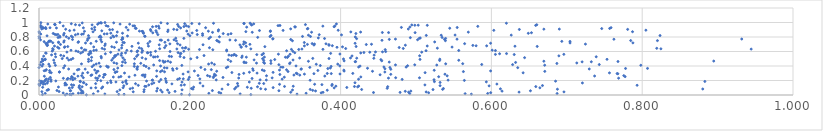
| Category | Series 0 |
|---|---|
| 0.03471809940780936 | 0.001 |
| 0.0628978927289243 | 0.002 |
| 0.1995794811079796 | 0.003 |
| 0.04272266488515289 | 0.004 |
| 0.2809404261100919 | 0.005 |
| 0.00458940075045273 | 0.006 |
| 0.04073927362761612 | 0.007 |
| 0.10568326306840174 | 0.008 |
| 0.11283316601962923 | 0.009 |
| 0.18900033131436 | 0.01 |
| 0.5734432919493996 | 0.011 |
| 0.34219767440783155 | 0.012 |
| 0.03703062416410229 | 0.013 |
| 0.08734879108575241 | 0.014 |
| 0.26676368256001 | 0.015 |
| 0.07212546008012231 | 0.016 |
| 0.045039601844262374 | 0.017 |
| 0.5651639700341141 | 0.018 |
| 0.4916722516117987 | 0.019 |
| 0.6871632711086179 | 0.02 |
| 0.5950885448225613 | 0.021 |
| 0.008232136410875118 | 0.022 |
| 0.22529547685810605 | 0.023 |
| 0.354276858125332 | 0.024 |
| 0.05226722493451394 | 0.025 |
| 0.24112710883399305 | 0.026 |
| 0.05593852667634817 | 0.027 |
| 0.03205019689438694 | 0.028 |
| 0.05841665688824747 | 0.029 |
| 0.3742544230528102 | 0.03 |
| 0.5167700513902381 | 0.031 |
| 0.5990619411059558 | 0.032 |
| 0.17256728204250313 | 0.033 |
| 0.4436390142723057 | 0.034 |
| 0.23860491473609152 | 0.035 |
| 0.47890002115238584 | 0.036 |
| 0.3766793765617339 | 0.037 |
| 0.33390334288328993 | 0.038 |
| 0.490169405845859 | 0.039 |
| 0.6366989414177403 | 0.04 |
| 0.16339558320439831 | 0.041 |
| 0.5134841379907712 | 0.042 |
| 0.6962454062782091 | 0.043 |
| 0.12495075305761767 | 0.044 |
| 0.13908367029248447 | 0.045 |
| 0.0038261332480417306 | 0.046 |
| 0.10363494464167652 | 0.047 |
| 0.02666417599809024 | 0.048 |
| 0.05788061085059919 | 0.049 |
| 0.18041761129008815 | 0.05 |
| 0.4857575244416236 | 0.051 |
| 0.07821202388468833 | 0.052 |
| 0.6141264319013726 | 0.053 |
| 0.4931575899874741 | 0.054 |
| 0.1560687274236829 | 0.055 |
| 0.3667760526250396 | 0.056 |
| 0.041467478363544384 | 0.057 |
| 0.651762081948474 | 0.058 |
| 0.3181924649397415 | 0.059 |
| 0.041938916326764955 | 0.06 |
| 0.22996427571882547 | 0.061 |
| 0.023818548999440824 | 0.062 |
| 0.05607006581198335 | 0.063 |
| 0.3630039059877329 | 0.064 |
| 0.010706427298888106 | 0.065 |
| 0.3822912778572393 | 0.066 |
| 0.16137181000215312 | 0.067 |
| 0.1705506427811281 | 0.068 |
| 0.33617952920377425 | 0.069 |
| 0.1072434301678051 | 0.07 |
| 0.18970289573768265 | 0.071 |
| 0.011919637866241931 | 0.072 |
| 0.13945450547457305 | 0.073 |
| 0.012626511981810674 | 0.074 |
| 0.522544051609832 | 0.075 |
| 0.4279122220621081 | 0.076 |
| 0.3596948129236601 | 0.077 |
| 0.5353008816723677 | 0.078 |
| 0.30040965233749994 | 0.079 |
| 0.6875564332954436 | 0.08 |
| 0.2041911940116624 | 0.081 |
| 0.24275476256825362 | 0.082 |
| 0.880329101515241 | 0.083 |
| 0.2594820889880252 | 0.084 |
| 0.6119454273611243 | 0.085 |
| 0.12087409792790396 | 0.086 |
| 0.29410980355177063 | 0.087 |
| 0.05433644718127161 | 0.088 |
| 0.5363418149445005 | 0.089 |
| 0.20221723085520488 | 0.09 |
| 0.15708281126850593 | 0.091 |
| 0.4617998573228683 | 0.092 |
| 0.28145601555439903 | 0.093 |
| 0.08302498559786625 | 0.094 |
| 0.12415126030437161 | 0.095 |
| 0.04024717275251662 | 0.096 |
| 0.06904251405017885 | 0.097 |
| 0.3914622530654389 | 0.098 |
| 0.6642868298106459 | 0.099 |
| 0.07524963989739945 | 0.1 |
| 0.111561000824211 | 0.101 |
| 0.3105564579563765 | 0.102 |
| 0.044081361840766935 | 0.103 |
| 0.4082596048288342 | 0.104 |
| 0.261264479569981 | 0.105 |
| 0.004875686387482808 | 0.106 |
| 0.27630944897067305 | 0.107 |
| 0.05298331487327896 | 0.108 |
| 0.20505330731190602 | 0.109 |
| 0.025765676545941356 | 0.11 |
| 0.08451030064530701 | 0.111 |
| 0.42262434564059803 | 0.112 |
| 0.28978327593787256 | 0.113 |
| 0.057212493912730304 | 0.114 |
| 0.4624781099222941 | 0.115 |
| 0.6589145081342206 | 0.116 |
| 0.41836644092661546 | 0.117 |
| 0.3256312928466535 | 0.118 |
| 0.14191624087516122 | 0.119 |
| 0.14039482641103404 | 0.12 |
| 0.33717231160639816 | 0.121 |
| 0.39376503415491987 | 0.122 |
| 0.4240374867847168 | 0.123 |
| 0.2174783746466326 | 0.124 |
| 0.2639670029187382 | 0.125 |
| 0.5969808709128088 | 0.126 |
| 0.11249358890958965 | 0.127 |
| 0.05361720363638991 | 0.128 |
| 0.5319229688659332 | 0.129 |
| 0.6677327093335624 | 0.13 |
| 0.3884080300951939 | 0.131 |
| 0.000611741904005162 | 0.132 |
| 0.13166332875138906 | 0.133 |
| 0.7932555019351889 | 0.134 |
| 0.18857127762805748 | 0.135 |
| 0.045950398561714796 | 0.136 |
| 0.034476640670317124 | 0.137 |
| 0.14553068648207249 | 0.138 |
| 0.5118206896432099 | 0.139 |
| 0.19285384405647285 | 0.14 |
| 0.043098717417665765 | 0.141 |
| 0.036516338688722776 | 0.142 |
| 0.37523556197761504 | 0.143 |
| 0.2507074446286727 | 0.144 |
| 0.06280450374776488 | 0.145 |
| 0.3888372965230126 | 0.146 |
| 0.3190216688241352 | 0.147 |
| 0.3655627960094509 | 0.148 |
| 0.005541210735868596 | 0.149 |
| 7.1900883607084026e-06 | 0.15 |
| 0.6072940502756272 | 0.151 |
| 0.008189738271355903 | 0.152 |
| 0.17627504904796445 | 0.153 |
| 0.14960223217209573 | 0.154 |
| 0.11642154200853289 | 0.155 |
| 0.12803755797038394 | 0.156 |
| 0.0751472752899637 | 0.157 |
| 0.2980282073153421 | 0.158 |
| 0.2632618578911238 | 0.159 |
| 0.03461534814823858 | 0.16 |
| 0.29218597003844077 | 0.161 |
| 0.00233549013342365 | 0.162 |
| 0.01090697851833 | 0.163 |
| 0.034792395443925574 | 0.164 |
| 0.21367801700573347 | 0.165 |
| 0.7206965269950599 | 0.166 |
| 0.15225775162921715 | 0.167 |
| 0.09077452260502218 | 0.168 |
| 0.4190810892948953 | 0.169 |
| 0.05944025711563548 | 0.17 |
| 0.05889594199813843 | 0.171 |
| 0.09558621128054091 | 0.172 |
| 0.5319841618874185 | 0.173 |
| 0.1689444443864776 | 0.174 |
| 0.11090124369358347 | 0.175 |
| 0.003726154375924736 | 0.176 |
| 0.006041756198938225 | 0.177 |
| 0.1896863319295612 | 0.178 |
| 0.27891789998567684 | 0.179 |
| 0.10202388309399066 | 0.18 |
| 0.5932769416555409 | 0.181 |
| 0.11496287427511492 | 0.182 |
| 0.05476371577313178 | 0.183 |
| 0.5244360330175999 | 0.184 |
| 0.15936434154720303 | 0.185 |
| 0.011753132534976278 | 0.186 |
| 0.8831109198005543 | 0.187 |
| 0.0036409457837047908 | 0.188 |
| 0.015941815224478222 | 0.189 |
| 0.05472714183517456 | 0.19 |
| 0.6851000619662838 | 0.191 |
| 0.14265169189983237 | 0.192 |
| 0.16848742929608185 | 0.193 |
| 0.022313120783578177 | 0.194 |
| 0.09503102116775146 | 0.195 |
| 0.0008154370503518378 | 0.196 |
| 0.08199804958304724 | 0.197 |
| 0.11548161298484308 | 0.198 |
| 0.007898271563472876 | 0.199 |
| 0.008359579164827434 | 0.2 |
| 0.5641380291285236 | 0.201 |
| 0.07733214513153186 | 0.202 |
| 0.3595851993224378 | 0.203 |
| 0.15011344296633353 | 0.204 |
| 0.5425579512195322 | 0.205 |
| 0.1506121203801931 | 0.206 |
| 0.3014965921999305 | 0.207 |
| 0.2350363670292999 | 0.208 |
| 0.29327335490797884 | 0.209 |
| 0.04489719061794627 | 0.21 |
| 0.5239257784372534 | 0.211 |
| 0.015912076300887014 | 0.212 |
| 0.16165354042680943 | 0.213 |
| 0.1980573061667286 | 0.214 |
| 0.4816543484996709 | 0.215 |
| 0.1838676372200513 | 0.216 |
| 0.037317213896918965 | 0.217 |
| 0.4238377919819418 | 0.218 |
| 0.3224806405029496 | 0.219 |
| 0.01273777077825116 | 0.22 |
| 0.009508161043824442 | 0.221 |
| 0.2133345762788506 | 0.222 |
| 0.1913444896286617 | 0.223 |
| 0.0418507541190621 | 0.224 |
| 0.16773964958216478 | 0.225 |
| 0.04770708008957383 | 0.226 |
| 0.18637681478597456 | 0.227 |
| 0.2825907315105212 | 0.228 |
| 0.03831711613170055 | 0.229 |
| 0.03230658192310319 | 0.23 |
| 0.07780079311564603 | 0.231 |
| 0.768697666336442 | 0.232 |
| 0.4634868395529909 | 0.233 |
| 0.26487481138109087 | 0.234 |
| 0.07522456268617307 | 0.235 |
| 0.30922669091245286 | 0.236 |
| 0.504630406648886 | 0.237 |
| 0.47304049548916305 | 0.238 |
| 0.058745583537544666 | 0.239 |
| 0.044533608705758954 | 0.24 |
| 0.23125476566855008 | 0.241 |
| 0.24402720612622966 | 0.242 |
| 0.01503106018451183 | 0.243 |
| 0.19937547243035578 | 0.244 |
| 0.08535569461892908 | 0.245 |
| 0.3253806636469633 | 0.246 |
| 0.1059053345086129 | 0.247 |
| 0.0985873178337911 | 0.248 |
| 0.4268306744202194 | 0.249 |
| 0.11953849103164473 | 0.25 |
| 0.14032961865323607 | 0.251 |
| 0.5300821696802024 | 0.252 |
| 0.7773616554910638 | 0.253 |
| 0.04333758169232757 | 0.254 |
| 0.10860341025454529 | 0.255 |
| 0.22654594426146735 | 0.256 |
| 0.15592455087406681 | 0.257 |
| 0.23188347338659113 | 0.258 |
| 0.0071025876063942825 | 0.259 |
| 0.05163259693669916 | 0.26 |
| 0.37906587425781424 | 0.261 |
| 0.7368827575234774 | 0.262 |
| 0.08012160387229876 | 0.263 |
| 0.5413560611071198 | 0.264 |
| 0.3017354786237287 | 0.265 |
| 0.05666205496604354 | 0.266 |
| 0.7756275635578731 | 0.267 |
| 0.2234755236371808 | 0.268 |
| 0.21096871521085406 | 0.269 |
| 0.06896004237443044 | 0.27 |
| 0.2343200952470237 | 0.271 |
| 0.13696491451626405 | 0.272 |
| 0.12724584557715926 | 0.273 |
| 0.34586388748884606 | 0.274 |
| 0.3380625900229567 | 0.275 |
| 0.13821074596325691 | 0.276 |
| 0.1407299099413959 | 0.277 |
| 0.0700968193227045 | 0.278 |
| 0.4523827639489086 | 0.279 |
| 0.08685635075107226 | 0.28 |
| 0.08621907009853773 | 0.281 |
| 0.08783113242107383 | 0.282 |
| 0.31945961461484484 | 0.283 |
| 0.26530670035326187 | 0.284 |
| 0.4665659524326485 | 0.285 |
| 0.2327242303682464 | 0.286 |
| 0.538397141451541 | 0.287 |
| 0.3520267672578203 | 0.288 |
| 0.1911247349313269 | 0.289 |
| 0.3991755653434058 | 0.29 |
| 0.046509300293537496 | 0.291 |
| 0.3425802076114185 | 0.292 |
| 0.7677117270068199 | 0.293 |
| 0.36463714288319254 | 0.294 |
| 0.38762742736991357 | 0.295 |
| 0.7667373433114493 | 0.296 |
| 0.38231678921811507 | 0.297 |
| 0.4161804997733114 | 0.298 |
| 0.2715092122053982 | 0.299 |
| 0.3411857322697847 | 0.3 |
| 0.05795323616492153 | 0.301 |
| 0.289208307587499 | 0.302 |
| 0.11343314280583984 | 0.303 |
| 0.07587039691534074 | 0.304 |
| 0.756594715243724 | 0.305 |
| 0.6420871868655366 | 0.306 |
| 0.016188686394519033 | 0.307 |
| 0.5120737143426126 | 0.308 |
| 0.06459244647926607 | 0.309 |
| 0.255828935955592 | 0.31 |
| 0.10104166647140293 | 0.311 |
| 0.310472435389232 | 0.312 |
| 0.014256225937879799 | 0.313 |
| 0.2790443471239143 | 0.314 |
| 0.10150834580934051 | 0.315 |
| 0.027005234956321962 | 0.316 |
| 0.45869825822122945 | 0.317 |
| 0.027153423472237287 | 0.318 |
| 0.1977577005038018 | 0.319 |
| 0.1665027765540108 | 0.32 |
| 0.10339110338277385 | 0.321 |
| 0.16112216161119994 | 0.322 |
| 0.5628658752960788 | 0.323 |
| 0.33028206944237126 | 0.324 |
| 0.07690709674331188 | 0.325 |
| 0.6708129259465172 | 0.326 |
| 0.44231070244746884 | 0.327 |
| 0.2356799485863774 | 0.328 |
| 0.07825512031577464 | 0.329 |
| 0.4046790514153703 | 0.33 |
| 0.20612389206599277 | 0.331 |
| 0.5989498174361702 | 0.332 |
| 0.15615873808254596 | 0.333 |
| 0.29875546412737497 | 0.334 |
| 0.006860243491602771 | 0.335 |
| 0.16330788949999026 | 0.336 |
| 0.014109379243826579 | 0.337 |
| 0.36984005195980085 | 0.338 |
| 0.008882640243364335 | 0.339 |
| 0.28410356935901515 | 0.34 |
| 0.5241594916209306 | 0.341 |
| 0.1777765598621435 | 0.342 |
| 0.4042969388213863 | 0.343 |
| 0.3189625219726934 | 0.344 |
| 0.2961557875201831 | 0.345 |
| 0.07391791651520663 | 0.346 |
| 0.05098186520610617 | 0.347 |
| 0.328337934364357 | 0.348 |
| 0.009694697880555289 | 0.349 |
| 0.22854907028847377 | 0.35 |
| 0.099369032922932 | 0.351 |
| 0.2200711301831053 | 0.352 |
| 0.05296565246827242 | 0.353 |
| 0.1302528564961815 | 0.354 |
| 0.46661955445252357 | 0.355 |
| 0.34746490645865963 | 0.356 |
| 0.06124966572923453 | 0.357 |
| 0.03931799227433341 | 0.358 |
| 0.72978246467221 | 0.359 |
| 0.34795648475854074 | 0.36 |
| 0.2834532080291715 | 0.361 |
| 0.4588122406769389 | 0.362 |
| 0.1770913316767238 | 0.363 |
| 0.18278989371899224 | 0.364 |
| 0.3830989143492803 | 0.365 |
| 0.777945353772589 | 0.366 |
| 0.807054166963916 | 0.367 |
| 0.14577766463695283 | 0.368 |
| 0.43571150529235514 | 0.369 |
| 0.1299108531176551 | 0.37 |
| 0.10443514434361724 | 0.371 |
| 0.3864045022727991 | 0.372 |
| 0.16975924331188663 | 0.373 |
| 0.032562113510257236 | 0.374 |
| 0.1663083906333003 | 0.375 |
| 0.24843180475557702 | 0.376 |
| 0.6349205021025296 | 0.377 |
| 6.167264687932303e-05 | 0.378 |
| 0.4654016990676762 | 0.379 |
| 0.21470477600423482 | 0.38 |
| 0.35917836696480415 | 0.381 |
| 0.09152391007393411 | 0.382 |
| 0.3234960199982712 | 0.383 |
| 0.3207701961380073 | 0.384 |
| 0.4869133915931692 | 0.385 |
| 0.4239251980301315 | 0.386 |
| 0.4574200064156994 | 0.387 |
| 0.2504744135159386 | 0.388 |
| 0.09170437874656949 | 0.389 |
| 0.13079800034099 | 0.39 |
| 0.07048941527424074 | 0.391 |
| 0.08146966197268594 | 0.392 |
| 0.14198991693427282 | 0.393 |
| 0.38744614842626884 | 0.394 |
| 0.12637193248225095 | 0.395 |
| 0.014193829670142677 | 0.396 |
| 0.08972514468905825 | 0.397 |
| 0.004040042823961715 | 0.398 |
| 0.4258250423793592 | 0.399 |
| 0.1612595778009747 | 0.4 |
| 0.34089092150998357 | 0.401 |
| 0.3988885747732037 | 0.402 |
| 0.03417091451249012 | 0.403 |
| 0.4888495801364316 | 0.404 |
| 0.1099357428500894 | 0.405 |
| 0.37310666752756977 | 0.406 |
| 0.13913848100222367 | 0.407 |
| 0.1894625465907569 | 0.408 |
| 0.0217390392272025 | 0.409 |
| 0.7981777337451421 | 0.41 |
| 0.6706833401522698 | 0.411 |
| 0.07262733759442067 | 0.412 |
| 0.5275694775356127 | 0.413 |
| 0.15207461574396114 | 0.414 |
| 0.47277718223401294 | 0.415 |
| 0.49833643485434165 | 0.416 |
| 0.0011666816889231012 | 0.417 |
| 0.31815730007826054 | 0.418 |
| 0.6281397429819029 | 0.419 |
| 0.7430752865912482 | 0.42 |
| 0.5871554157696608 | 0.421 |
| 0.23260151404070914 | 0.422 |
| 0.005294381259561111 | 0.423 |
| 0.3677460319416551 | 0.424 |
| 0.012984211366346558 | 0.425 |
| 0.3961922901324097 | 0.426 |
| 0.22493594463675318 | 0.427 |
| 0.07584843641300586 | 0.428 |
| 0.05635406599450573 | 0.429 |
| 0.5393687697197099 | 0.43 |
| 0.12648480083874278 | 0.431 |
| 0.561973037608011 | 0.432 |
| 0.33235694000852906 | 0.433 |
| 0.10310874458819207 | 0.434 |
| 0.686855354160206 | 0.435 |
| 0.3075965417992604 | 0.436 |
| 0.13498258563468554 | 0.437 |
| 0.2990414311149292 | 0.438 |
| 0.07966462324538168 | 0.439 |
| 0.288468575909801 | 0.44 |
| 0.22903704526177915 | 0.441 |
| 0.7132732444081827 | 0.442 |
| 0.02050775444143845 | 0.443 |
| 0.3330994290242307 | 0.444 |
| 0.09946337381147652 | 0.445 |
| 0.27459772266150256 | 0.446 |
| 0.11453832964899256 | 0.447 |
| 0.27204983413377315 | 0.448 |
| 0.6320929305054975 | 0.449 |
| 0.29791903715325146 | 0.45 |
| 0.16562555887617114 | 0.451 |
| 0.17443223988767348 | 0.452 |
| 0.0026124178842774418 | 0.453 |
| 0.46450040999585857 | 0.454 |
| 0.11084577532635558 | 0.455 |
| 0.2719564793709447 | 0.456 |
| 0.7203146997885855 | 0.457 |
| 0.732532672127752 | 0.458 |
| 0.41931087486604046 | 0.459 |
| 0.16743550501053267 | 0.46 |
| 0.4198690984155091 | 0.461 |
| 0.767869646281046 | 0.462 |
| 0.06565233770591711 | 0.463 |
| 0.25424993906278676 | 0.464 |
| 0.3572947085660774 | 0.465 |
| 0.6695760209835853 | 0.466 |
| 0.1710891531772601 | 0.467 |
| 0.894895119511627 | 0.468 |
| 0.16440305239896671 | 0.469 |
| 0.0047625892593230945 | 0.47 |
| 0.4046802582770862 | 0.471 |
| 0.454612940617494 | 0.472 |
| 0.3074919005146573 | 0.473 |
| 0.06938842910951706 | 0.474 |
| 0.15995600280905015 | 0.475 |
| 0.5313447878591331 | 0.476 |
| 0.29811462349167467 | 0.477 |
| 0.005705545625478681 | 0.478 |
| 0.5567368573338418 | 0.479 |
| 0.0964698571083648 | 0.48 |
| 0.019521061159352458 | 0.481 |
| 0.03949699727104132 | 0.482 |
| 0.33691912842478083 | 0.483 |
| 0.2852628861362753 | 0.484 |
| 0.11341189960609314 | 0.485 |
| 0.2509014722012917 | 0.486 |
| 0.008178487248044793 | 0.487 |
| 0.45343892251714957 | 0.488 |
| 0.3126450769913859 | 0.489 |
| 0.04251380232729226 | 0.49 |
| 0.5053322498918039 | 0.491 |
| 0.7533477388778862 | 0.492 |
| 0.065726696857339 | 0.493 |
| 0.5316145442354967 | 0.494 |
| 0.008219883005189263 | 0.495 |
| 0.0042649954295582325 | 0.496 |
| 0.40380950871033117 | 0.497 |
| 0.14159978319381042 | 0.498 |
| 0.20132973718405742 | 0.499 |
| 0.12684357945398028 | 0.5 |
| 0.2965476014660339 | 0.501 |
| 0.030786848008764803 | 0.502 |
| 0.38462750114002653 | 0.503 |
| 0.04493505124880565 | 0.504 |
| 0.36308663678860376 | 0.505 |
| 0.4440697328066427 | 0.506 |
| 0.09832961428201951 | 0.507 |
| 0.4213963636621334 | 0.508 |
| 0.03738563911848336 | 0.509 |
| 0.34567844068332726 | 0.51 |
| 0.41315155871641923 | 0.511 |
| 0.08270253008204984 | 0.512 |
| 0.11116562918436237 | 0.513 |
| 0.13682419361282686 | 0.514 |
| 0.6440111646647143 | 0.515 |
| 0.1923030991032947 | 0.516 |
| 0.20971949432272471 | 0.517 |
| 0.32937170162213 | 0.518 |
| 0.26891542025229814 | 0.519 |
| 0.06977331422150784 | 0.52 |
| 0.3268061995367734 | 0.521 |
| 0.2749816428710077 | 0.522 |
| 0.2989246488515327 | 0.523 |
| 0.15190167574164753 | 0.524 |
| 0.15401869557377051 | 0.525 |
| 0.022060721491418148 | 0.526 |
| 0.7390149225450234 | 0.527 |
| 0.10053406421598254 | 0.528 |
| 0.15730495993996818 | 0.529 |
| 0.17575980460010865 | 0.53 |
| 0.08236212355038601 | 0.531 |
| 0.187165299467176 | 0.532 |
| 0.12943335123779112 | 0.533 |
| 0.17275676147282854 | 0.534 |
| 0.33077039693445576 | 0.535 |
| 0.006189331255499449 | 0.536 |
| 0.26948581095117985 | 0.537 |
| 0.0328124398288676 | 0.538 |
| 0.41516875552213944 | 0.539 |
| 0.6894970605336683 | 0.54 |
| 0.5048207430187995 | 0.541 |
| 0.10043300838975812 | 0.542 |
| 0.26159008932282257 | 0.543 |
| 0.21885462587238508 | 0.544 |
| 0.2553288276012641 | 0.545 |
| 0.10218411348873949 | 0.546 |
| 0.10908585641243582 | 0.547 |
| 0.02892299088675357 | 0.548 |
| 0.14835434678771767 | 0.549 |
| 0.4444885675302377 | 0.55 |
| 0.2518818459133718 | 0.551 |
| 0.25801183225420715 | 0.552 |
| 0.01666030629201785 | 0.553 |
| 0.1311738371930056 | 0.554 |
| 0.2957287159057605 | 0.555 |
| 0.06612583403133174 | 0.556 |
| 0.28884404141308284 | 0.557 |
| 0.6302644852270409 | 0.558 |
| 0.259285074550187 | 0.559 |
| 0.605359555686929 | 0.56 |
| 0.6960802403777886 | 0.561 |
| 0.3329826709811063 | 0.562 |
| 0.31752996811927353 | 0.563 |
| 0.10478025072383612 | 0.564 |
| 0.39908509475459025 | 0.565 |
| 0.02156325351721706 | 0.566 |
| 0.06597404966452941 | 0.567 |
| 0.08799577731649172 | 0.568 |
| 0.6108850746433825 | 0.569 |
| 0.18732666886146657 | 0.57 |
| 0.6200667755823314 | 0.571 |
| 0.29766693772819935 | 0.572 |
| 0.18822656610560187 | 0.573 |
| 0.38681835885500826 | 0.574 |
| 0.10963195375491587 | 0.575 |
| 0.06871684604326092 | 0.576 |
| 0.009523889601585532 | 0.577 |
| 0.055226326246527443 | 0.578 |
| 0.00877918745340028 | 0.579 |
| 0.4266816152437972 | 0.58 |
| 0.11475688925766003 | 0.581 |
| 0.144372712207974 | 0.582 |
| 0.339250092120636 | 0.583 |
| 0.1437137686199215 | 0.584 |
| 0.18448489872712232 | 0.585 |
| 0.4309088048355218 | 0.586 |
| 0.14805508483205268 | 0.587 |
| 0.13648577604223103 | 0.588 |
| 0.09502365371694865 | 0.589 |
| 0.43871620874545625 | 0.59 |
| 0.5075806703134103 | 0.591 |
| 0.03703685269291741 | 0.592 |
| 0.057888097297326226 | 0.593 |
| 0.44627424396964566 | 0.594 |
| 0.4555844565086663 | 0.595 |
| 0.1300615495776269 | 0.596 |
| 0.06760917233312819 | 0.597 |
| 0.052009324370257654 | 0.598 |
| 0.45977733886077005 | 0.599 |
| 0.17383976692341027 | 0.6 |
| 0.06841229927486198 | 0.601 |
| 0.33673737262062 | 0.602 |
| 0.15455055544944177 | 0.603 |
| 0.19208099266015208 | 0.604 |
| 0.01752939663969658 | 0.605 |
| 0.12242037380073942 | 0.606 |
| 0.04903151387271773 | 0.607 |
| 0.24894621728965977 | 0.608 |
| 0.13072938820050037 | 0.609 |
| 0.3284227193282942 | 0.61 |
| 0.5133397275864905 | 0.611 |
| 0.13733126419869293 | 0.612 |
| 0.6053387375435465 | 0.613 |
| 0.5566800485425932 | 0.614 |
| 0.0726945346357475 | 0.615 |
| 0.1165363048532343 | 0.616 |
| 0.04244138514666918 | 0.617 |
| 0.6010567476353659 | 0.618 |
| 0.07602343729643536 | 0.619 |
| 0.2488866203053398 | 0.62 |
| 0.06212265187336809 | 0.621 |
| 0.10609327838129609 | 0.622 |
| 0.06004084956402269 | 0.623 |
| 0.23053555377510973 | 0.624 |
| 0.018807366125997437 | 0.625 |
| 0.45917306559239834 | 0.626 |
| 0.21281755454301512 | 0.627 |
| 0.34451771724911207 | 0.628 |
| 0.3348129910751223 | 0.629 |
| 0.3765756136159649 | 0.63 |
| 0.19845381636079554 | 0.631 |
| 0.08690790329881559 | 0.632 |
| 0.9445386878970132 | 0.633 |
| 0.3487343344397009 | 0.634 |
| 0.18284296043548223 | 0.635 |
| 0.28096318352072996 | 0.636 |
| 0.8248052536265529 | 0.637 |
| 0.16006144440197628 | 0.638 |
| 0.13606760364120327 | 0.639 |
| 0.018159034453909297 | 0.64 |
| 0.40676443097523424 | 0.641 |
| 0.483100790074013 | 0.642 |
| 0.0837634944195228 | 0.643 |
| 0.8193213859798155 | 0.644 |
| 0.026472081383635257 | 0.645 |
| 0.5283237453878453 | 0.646 |
| 0.19377065971710838 | 0.647 |
| 0.05633780668100036 | 0.648 |
| 0.10959907841439157 | 0.649 |
| 0.19032683509154663 | 0.65 |
| 0.13296919706723787 | 0.651 |
| 0.2260647606104 | 0.652 |
| 0.16656507310666396 | 0.653 |
| 0.19466045876915108 | 0.654 |
| 0.4776998945110226 | 0.655 |
| 0.09999721667327244 | 0.656 |
| 0.03380336484315928 | 0.657 |
| 0.39522642181636725 | 0.658 |
| 0.02468752579687874 | 0.659 |
| 0.2680521969904701 | 0.66 |
| 0.5478323356039206 | 0.661 |
| 0.2681926372660439 | 0.662 |
| 0.07253878727926509 | 0.663 |
| 0.4025034625721182 | 0.664 |
| 0.03433373538018606 | 0.665 |
| 0.0965720595687301 | 0.666 |
| 0.2995599793439444 | 0.667 |
| 0.038181114647205985 | 0.668 |
| 0.4205774008004152 | 0.669 |
| 0.6607418391946567 | 0.67 |
| 0.12330772757874686 | 0.671 |
| 0.2747732306191111 | 0.672 |
| 0.6312574332444723 | 0.673 |
| 0.14513789665637739 | 0.674 |
| 0.020558050861124624 | 0.675 |
| 0.5148784609281423 | 0.676 |
| 0.3519995884371279 | 0.677 |
| 0.5937267455817316 | 0.678 |
| 0.5797305384327315 | 0.679 |
| 0.38905102066798647 | 0.68 |
| 0.16830454863137145 | 0.681 |
| 0.010942095898177571 | 0.682 |
| 0.08728504588547246 | 0.683 |
| 0.5753972236288527 | 0.684 |
| 0.38462711226770663 | 0.685 |
| 0.11003936139774315 | 0.686 |
| 0.4858842694384781 | 0.687 |
| 0.011226080879135084 | 0.688 |
| 0.36464433825909026 | 0.689 |
| 0.18711975803363978 | 0.69 |
| 0.26645127727052925 | 0.691 |
| 0.15946144232925338 | 0.692 |
| 0.21756859212455193 | 0.693 |
| 0.010263128607558552 | 0.694 |
| 0.38449345536644675 | 0.695 |
| 0.43407793551210727 | 0.696 |
| 0.028476774245335568 | 0.697 |
| 0.3559970015433384 | 0.698 |
| 0.2797453834172692 | 0.699 |
| 0.440970511225116 | 0.7 |
| 0.2713039340295634 | 0.701 |
| 0.724722542922178 | 0.702 |
| 0.36530471909490864 | 0.703 |
| 0.08790551053700295 | 0.704 |
| 0.17360535621930914 | 0.705 |
| 0.38061441389301176 | 0.706 |
| 0.1837982089058247 | 0.707 |
| 0.5644942534499625 | 0.708 |
| 0.3622800197650563 | 0.709 |
| 0.14446129862037643 | 0.71 |
| 0.009089604173642204 | 0.711 |
| 0.06876600120620838 | 0.712 |
| 0.41923118508480134 | 0.713 |
| 0.5989414910620602 | 0.714 |
| 0.1316938653907171 | 0.715 |
| 0.010990765026392242 | 0.716 |
| 0.061718351077816404 | 0.717 |
| 0.7043238942045561 | 0.718 |
| 0.7876777256691083 | 0.719 |
| 0.27401124072757493 | 0.72 |
| 0.018289896095385155 | 0.721 |
| 0.11311941605693143 | 0.722 |
| 0.025887504184609004 | 0.723 |
| 0.35187727005404285 | 0.724 |
| 0.11129818054970218 | 0.725 |
| 0.0518481792161186 | 0.726 |
| 0.16704090213586303 | 0.727 |
| 0.10275068432802456 | 0.728 |
| 0.02589838837799512 | 0.729 |
| 0.03286386000824537 | 0.73 |
| 0.23904203461252127 | 0.731 |
| 0.5247723767531658 | 0.732 |
| 0.2717481979765075 | 0.733 |
| 0.08311528223036455 | 0.734 |
| 0.05238274556382606 | 0.735 |
| 0.006797210627545045 | 0.736 |
| 0.012974203500908514 | 0.737 |
| 0.147061659062777 | 0.738 |
| 0.7042396521413385 | 0.739 |
| 0.6933984997682874 | 0.74 |
| 0.07593928326361103 | 0.741 |
| 0.015617801442791866 | 0.742 |
| 0.0132929991414208 | 0.743 |
| 0.23718193179496244 | 0.744 |
| 0.014461839550504006 | 0.745 |
| 0.18220423264400562 | 0.746 |
| 0.033385334709509634 | 0.747 |
| 0.3360867823151505 | 0.748 |
| 0.5390008287902006 | 0.749 |
| 0.8202271157947166 | 0.75 |
| 0.7847408557561526 | 0.751 |
| 0.23577276980153078 | 0.752 |
| 0.0641549245584603 | 0.753 |
| 0.45490264767169314 | 0.754 |
| 0.2607279124113309 | 0.755 |
| 0.1623701922616656 | 0.756 |
| 0.1713230137803098 | 0.757 |
| 0.1606999202643882 | 0.758 |
| 0.2532001276652573 | 0.759 |
| 0.0019483463118437877 | 0.76 |
| 0.1791204546829142 | 0.761 |
| 0.5021055035564679 | 0.762 |
| 0.08189538207487373 | 0.763 |
| 0.10968024945652532 | 0.764 |
| 0.04446253601071941 | 0.765 |
| 0.33388850441645573 | 0.766 |
| 0.46460060695936556 | 0.767 |
| 0.5377689436354547 | 0.768 |
| 0.7624754423769129 | 0.769 |
| 0.5544220903924674 | 0.77 |
| 0.4727447007638262 | 0.771 |
| 0.9320244292787004 | 0.772 |
| 0.31005265498989465 | 0.773 |
| 0.11108073122242482 | 0.774 |
| 0.06470016325731688 | 0.775 |
| 0.31034252820542774 | 0.776 |
| 0.421240308025953 | 0.777 |
| 0.22532314638928913 | 0.778 |
| 0.37871934753959385 | 0.779 |
| 0.5392839212368836 | 0.78 |
| 0.19212489964081753 | 0.781 |
| 0.5044029799745942 | 0.782 |
| 0.03948138648994916 | 0.783 |
| 0.18133612482529624 | 0.784 |
| 0.00021045642954777363 | 0.785 |
| 0.5056537012332012 | 0.786 |
| 0.3704755113415109 | 0.787 |
| 0.06651328039325614 | 0.788 |
| 0.0953556275557179 | 0.789 |
| 0.0007354593556386154 | 0.79 |
| 0.4924994974968036 | 0.791 |
| 0.11075848647157838 | 0.792 |
| 0.025292981929191757 | 0.793 |
| 0.534624455527273 | 0.794 |
| 0.2900706867612409 | 0.795 |
| 0.08231849769200213 | 0.796 |
| 0.027769812034265946 | 0.797 |
| 0.22743152102649866 | 0.798 |
| 0.044406404103625514 | 0.799 |
| 0.079797091219841 | 0.8 |
| 0.4194599698720297 | 0.801 |
| 0.09924925004301612 | 0.802 |
| 0.23935541985109185 | 0.803 |
| 0.03628099044705775 | 0.804 |
| 0.00020986174901923112 | 0.805 |
| 0.306406374672776 | 0.806 |
| 0.3600338309641422 | 0.807 |
| 0.34948161011590717 | 0.808 |
| 0.14067511035934752 | 0.809 |
| 0.02751004089944957 | 0.81 |
| 0.04286549223900811 | 0.811 |
| 0.1401013608746107 | 0.812 |
| 0.08125853527574349 | 0.813 |
| 0.11735866811713734 | 0.814 |
| 0.09791698753446933 | 0.815 |
| 0.010663578819295578 | 0.816 |
| 0.10274813941468205 | 0.817 |
| 0.20009458629060772 | 0.818 |
| 0.06559618974938665 | 0.819 |
| 0.8236678922254151 | 0.82 |
| 0.30771181905794226 | 0.821 |
| 0.5136565974725024 | 0.822 |
| 0.21696184378839958 | 0.823 |
| 0.5334454063533679 | 0.824 |
| 0.3573646427252445 | 0.825 |
| 0.6263134554537287 | 0.826 |
| 0.5518290174171225 | 0.827 |
| 0.03264933603587413 | 0.828 |
| 0.40119361622143274 | 0.829 |
| 0.048249091049021656 | 0.83 |
| 0.022869568918446097 | 0.831 |
| 0.3716509345945355 | 0.832 |
| 0.157643222588461 | 0.833 |
| 0.20991585276436378 | 0.834 |
| 0.025095127433730324 | 0.835 |
| 0.25080148515192 | 0.836 |
| 0.05654362625343747 | 0.837 |
| 0.02091611866473242 | 0.838 |
| 0.19774928122612373 | 0.839 |
| 0.0023121000912087785 | 0.84 |
| 0.051612818612306315 | 0.841 |
| 0.08652592391776051 | 0.842 |
| 0.058842786241897774 | 0.843 |
| 0.09024324575559226 | 0.844 |
| 0.21690901265993953 | 0.845 |
| 0.2546462419272897 | 0.846 |
| 0.24432074890907043 | 0.847 |
| 0.4202923453049453 | 0.848 |
| 0.01881300725538497 | 0.849 |
| 0.0333546662564068 | 0.85 |
| 0.6489548205266239 | 0.851 |
| 0.11075409977827749 | 0.852 |
| 0.09524949693434852 | 0.853 |
| 0.13846281019172937 | 0.854 |
| 0.1384040003004958 | 0.855 |
| 0.20314425309111714 | 0.856 |
| 0.0003123315298378815 | 0.857 |
| 0.15090193207514666 | 0.858 |
| 0.6531190018665002 | 0.859 |
| 0.49880479808003403 | 0.86 |
| 0.46362676744256165 | 0.861 |
| 0.45538672538928965 | 0.862 |
| 0.15613720588392735 | 0.863 |
| 0.23013150895870654 | 0.864 |
| 0.28282122533530624 | 0.865 |
| 0.36149611945861504 | 0.866 |
| 0.5693877039480346 | 0.867 |
| 0.4265493191309624 | 0.868 |
| 0.10377855050889906 | 0.869 |
| 0.413573949867351 | 0.87 |
| 0.07162643240428822 | 0.871 |
| 0.00023693728467423554 | 0.872 |
| 0.7871860757737146 | 0.873 |
| 0.2743490447664397 | 0.874 |
| 0.1707268162686626 | 0.875 |
| 0.30686268675083855 | 0.876 |
| 0.13760156066320536 | 0.877 |
| 0.06032187736196577 | 0.878 |
| 0.13666406598167993 | 0.879 |
| 0.2246436072171056 | 0.88 |
| 0.13321444269430002 | 0.881 |
| 0.1959422679002759 | 0.882 |
| 0.23774264492928132 | 0.883 |
| 0.30687811475116805 | 0.884 |
| 0.08327850644425507 | 0.885 |
| 0.14830354338768997 | 0.886 |
| 0.1551272394438019 | 0.887 |
| 0.040668123071798144 | 0.888 |
| 0.2923774988996165 | 0.889 |
| 0.2092539197880698 | 0.89 |
| 0.32374350666279966 | 0.891 |
| 0.6031998761003992 | 0.892 |
| 0.39680356803254346 | 0.893 |
| 0.8049084382901687 | 0.894 |
| 0.04661247604191905 | 0.895 |
| 0.171215183125895 | 0.896 |
| 0.11810800255081487 | 0.897 |
| 0.07389388828223674 | 0.898 |
| 0.2381511174876884 | 0.899 |
| 0.18300499395031722 | 0.9 |
| 0.09380456887083066 | 0.901 |
| 0.09751208724205575 | 0.902 |
| 0.1478500874178585 | 0.903 |
| 0.6370661805317597 | 0.904 |
| 0.7807071802502122 | 0.905 |
| 0.17870485761044522 | 0.906 |
| 0.03535885910713547 | 0.907 |
| 0.6695867091790114 | 0.908 |
| 0.6900850511504302 | 0.909 |
| 0.4897903919086492 | 0.91 |
| 0.0036438825303783404 | 0.911 |
| 0.33378710145483337 | 0.912 |
| 0.3559082113929946 | 0.913 |
| 0.07010413822353301 | 0.914 |
| 0.009210203540438498 | 0.915 |
| 0.7463282497772391 | 0.916 |
| 0.3565765485770876 | 0.917 |
| 0.7568517959387328 | 0.918 |
| 0.12887677485770396 | 0.919 |
| 0.12777154364966134 | 0.92 |
| 0.5447331572324364 | 0.921 |
| 0.15932994682645804 | 0.922 |
| 0.006209333297878165 | 0.923 |
| 0.02313730901676202 | 0.924 |
| 0.18785559192264484 | 0.925 |
| 0.05885835433342464 | 0.926 |
| 0.014611540964199332 | 0.927 |
| 0.22098632486837777 | 0.928 |
| 0.758680412473606 | 0.929 |
| 0.008757599610012535 | 0.93 |
| 0.5546157464818958 | 0.931 |
| 0.4806299482211678 | 0.932 |
| 0.11566140322793428 | 0.933 |
| 0.07382170268890997 | 0.934 |
| 0.0046468895359679735 | 0.935 |
| 0.2754735442046064 | 0.936 |
| 0.49188091459862104 | 0.937 |
| 0.0022357533767745543 | 0.938 |
| 0.34001754203958917 | 0.939 |
| 0.33913641213091367 | 0.94 |
| 0.15060496881535776 | 0.941 |
| 0.3913690724618982 | 0.942 |
| 0.19837984507381895 | 0.943 |
| 0.19220517860635863 | 0.944 |
| 0.1852260233887558 | 0.945 |
| 0.15540432196491705 | 0.946 |
| 0.5819598029981442 | 0.947 |
| 0.0915084185886788 | 0.948 |
| 0.1585734661980254 | 0.949 |
| 0.3764748754838272 | 0.95 |
| 0.39239022756199043 | 0.951 |
| 0.032109809233662925 | 0.952 |
| 0.12678207884367984 | 0.953 |
| 0.12467073367828604 | 0.954 |
| 0.1953256165552153 | 0.955 |
| 0.08905712938973277 | 0.956 |
| 0.3170358142076511 | 0.957 |
| 0.0022656780897970497 | 0.958 |
| 0.31959825132012976 | 0.959 |
| 0.6587171542691723 | 0.96 |
| 0.5149583342110331 | 0.961 |
| 0.49847732662181204 | 0.962 |
| 0.502922059590579 | 0.963 |
| 0.05366123686770637 | 0.964 |
| 0.2820864523071542 | 0.965 |
| 0.4944356486222432 | 0.966 |
| 0.07042672740270747 | 0.967 |
| 0.021340570948165338 | 0.968 |
| 0.6601934912381572 | 0.969 |
| 0.04836924513416249 | 0.97 |
| 0.3533747545523968 | 0.971 |
| 0.021078234785398473 | 0.972 |
| 0.18383093914113668 | 0.973 |
| 0.28130268346642684 | 0.974 |
| 0.020764402361509417 | 0.975 |
| 0.0777760648888701 | 0.976 |
| 0.12022548353307695 | 0.977 |
| 0.1075103674482773 | 0.978 |
| 0.011684371497463984 | 0.979 |
| 0.3944481915209934 | 0.98 |
| 0.2847864996037923 | 0.981 |
| 0.21257348010441302 | 0.982 |
| 0.042860883836263845 | 0.983 |
| 0.19324251062269543 | 0.984 |
| 0.27191947766588614 | 0.985 |
| 0.17031990830242708 | 0.986 |
| 0.20267322242241465 | 0.987 |
| 0.27186228132025936 | 0.988 |
| 0.23146692246989442 | 0.989 |
| 0.6198908249252307 | 0.99 |
| 0.27995513716691217 | 0.991 |
| 0.07943877301158886 | 0.992 |
| 0.08276154321040133 | 0.993 |
| 0.057325498868829865 | 0.994 |
| 0.09910886640497579 | 0.995 |
| 0.16172242164534195 | 0.996 |
| 0.081761353455884 | 0.997 |
| 0.0025168505279999577 | 0.998 |
| 0.08746700913043859 | 0.999 |
| 0.027726296867254096 | 1 |